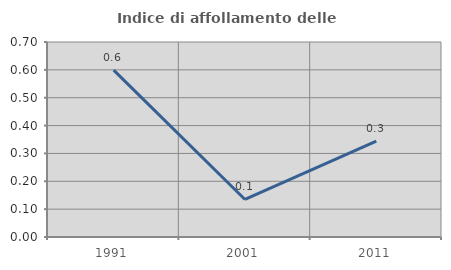
| Category | Indice di affollamento delle abitazioni  |
|---|---|
| 1991.0 | 0.599 |
| 2001.0 | 0.135 |
| 2011.0 | 0.344 |